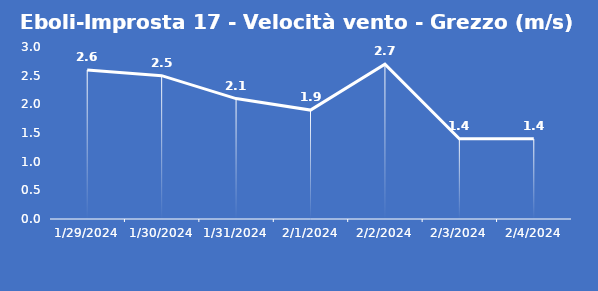
| Category | Eboli-Improsta 17 - Velocità vento - Grezzo (m/s) |
|---|---|
| 1/29/24 | 2.6 |
| 1/30/24 | 2.5 |
| 1/31/24 | 2.1 |
| 2/1/24 | 1.9 |
| 2/2/24 | 2.7 |
| 2/3/24 | 1.4 |
| 2/4/24 | 1.4 |